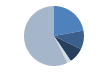
| Category | Series 0 |
|---|---|
| 0 | 186 |
| 1 | 85 |
| 2 | 70 |
| 3 | 18 |
| 4 | 482 |